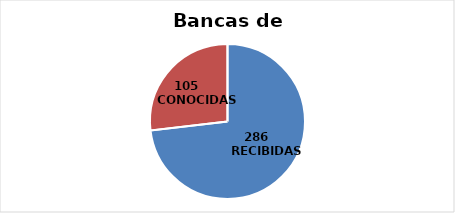
| Category | Series 0 |
|---|---|
| 0 | 286 |
| 1 | 105 |